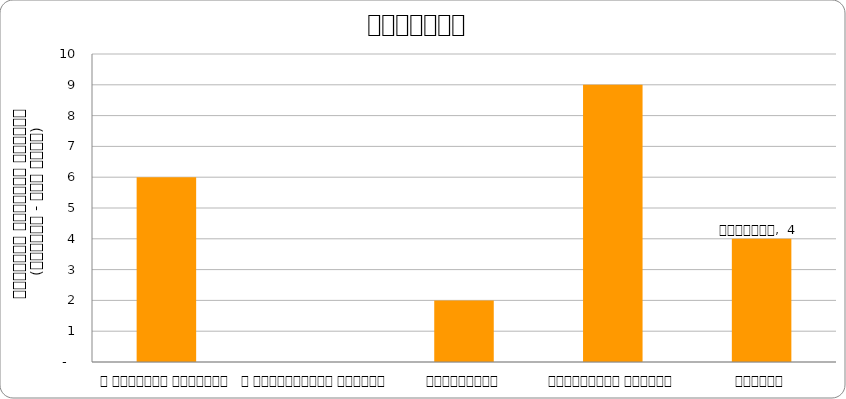
| Category | सुरक्षा |
|---|---|
| द हिमालयन टाइम्स् | 6 |
| द काठमाण्डौं पोस्ट् | 0 |
| कान्तिपुर | 2 |
| अन्नपूर्ण पोस्ट् | 9 |
| नागरिक | 4 |